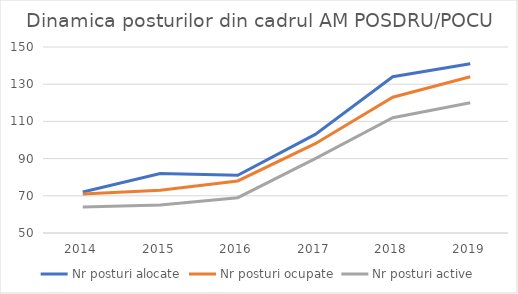
| Category | Nr posturi alocate | Nr posturi ocupate | Nr posturi active |
|---|---|---|---|
| 2014.0 | 72 | 71 | 64 |
| 2015.0 | 82 | 73 | 65 |
| 2016.0 | 81 | 78 | 69 |
| 2017.0 | 103 | 98 | 90 |
| 2018.0 | 134 | 123 | 112 |
| 2019.0 | 141 | 134 | 120 |